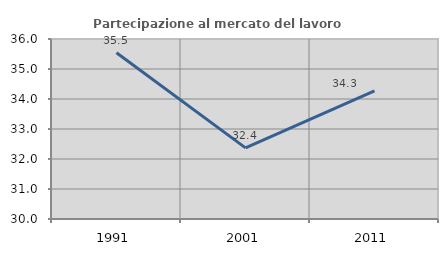
| Category | Partecipazione al mercato del lavoro  femminile |
|---|---|
| 1991.0 | 35.541 |
| 2001.0 | 32.371 |
| 2011.0 | 34.271 |